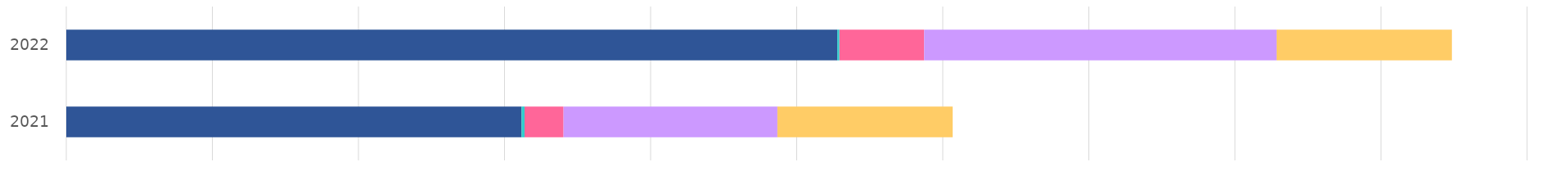
| Category | Streaming | Downloads & other digital | Physical | Performance rights | Synchronisation |
|---|---|---|---|---|---|
| 2021.0 | 31.162 | 0.211 | 2.666 | 14.64 | 12 |
| 2022.0 | 52.781 | 0.148 | 5.799 | 24.127 | 12 |